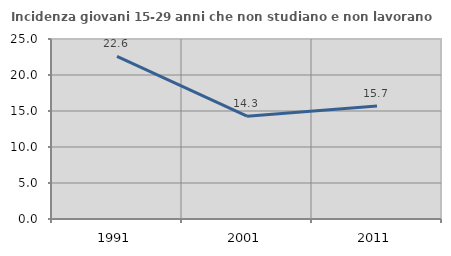
| Category | Incidenza giovani 15-29 anni che non studiano e non lavorano  |
|---|---|
| 1991.0 | 22.589 |
| 2001.0 | 14.286 |
| 2011.0 | 15.686 |